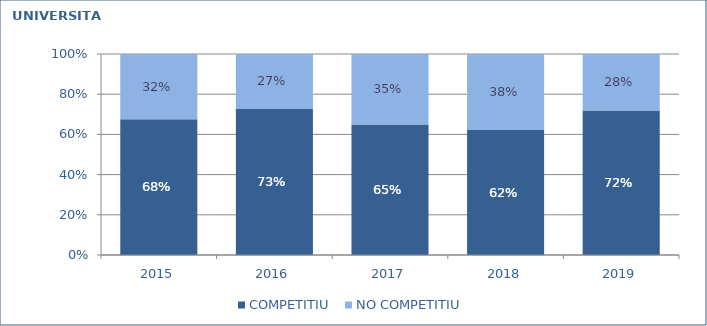
| Category | COMPETITIU  | NO COMPETITIU |
|---|---|---|
| 2015.0 | 0.676 | 0.324 |
| 2016.0 | 0.727 | 0.273 |
| 2017.0 | 0.65 | 0.35 |
| 2018.0 | 0.622 | 0.378 |
| 2019.0 | 0.718 | 0.282 |